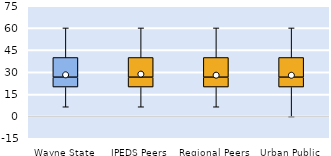
| Category | 25th | 50th | 75th |
|---|---|---|---|
| Wayne State | 20 | 6.667 | 13.333 |
| IPEDS Peers | 20 | 6.667 | 13.333 |
| Regional Peers | 20 | 6.667 | 13.333 |
| Urban Public | 20 | 6.667 | 13.333 |